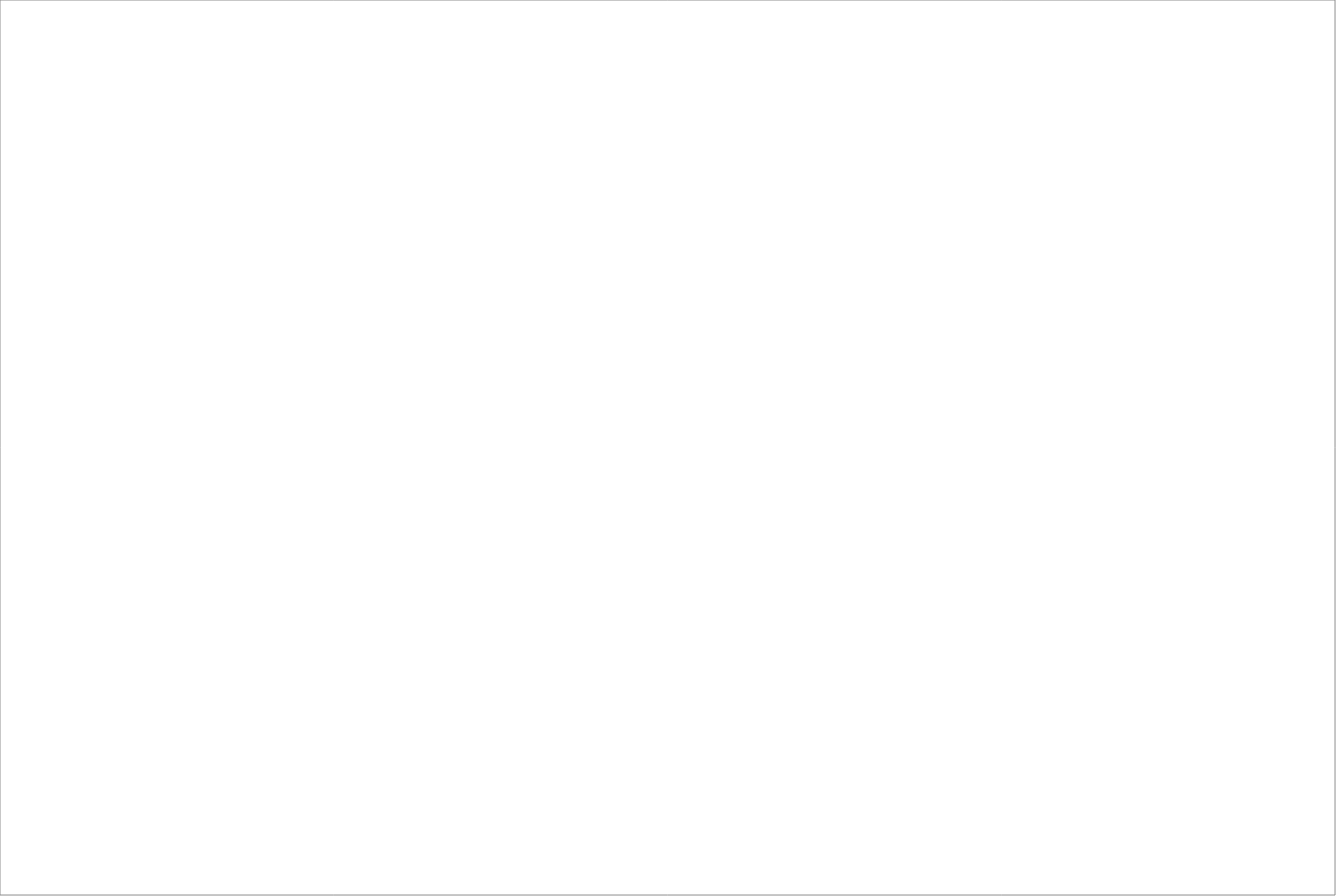
| Category | Total |
|---|---|
| Randstad AB | 69.6 |
| Poolia Sverige Aktiebolag | 65 |
| StudentConsulting Sweden AB | 65 |
| Experis AB | 62.5 |
| Academic Work Sweden AB | 62.5 |